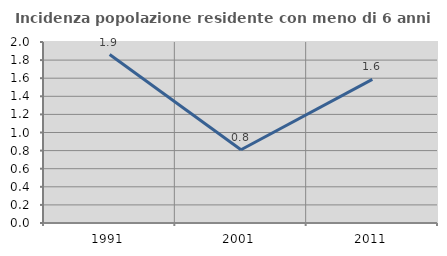
| Category | Incidenza popolazione residente con meno di 6 anni |
|---|---|
| 1991.0 | 1.861 |
| 2001.0 | 0.81 |
| 2011.0 | 1.587 |